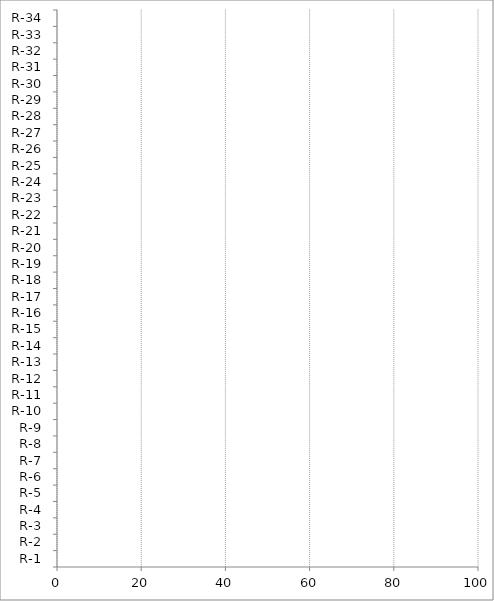
| Category | Series 0 |
|---|---|
| R-1 | 0 |
| R-2 | 0 |
| R-3 | 0 |
| R-4 | 0 |
| R-5 | 0 |
| R-6 | 0 |
| R-7 | 0 |
| R-8 | 0 |
| R-9 | 0 |
| R-10 | 0 |
| R-11 | 0 |
| R-12 | 0 |
| R-13 | 0 |
| R-14 | 0 |
| R-15 | 0 |
| R-16 | 0 |
| R-17 | 0 |
| R-18 | 0 |
| R-19 | 0 |
| R-20 | 0 |
| R-21 | 0 |
| R-22 | 0 |
| R-23 | 0 |
| R-24 | 0 |
| R-25 | 0 |
| R-26 | 0 |
| R-27 | 0 |
| R-28 | 0 |
| R-29 | 0 |
| R-30 | 0 |
| R-31 | 0 |
| R-32 | 0 |
| R-33 | 0 |
| R-34 | 0 |